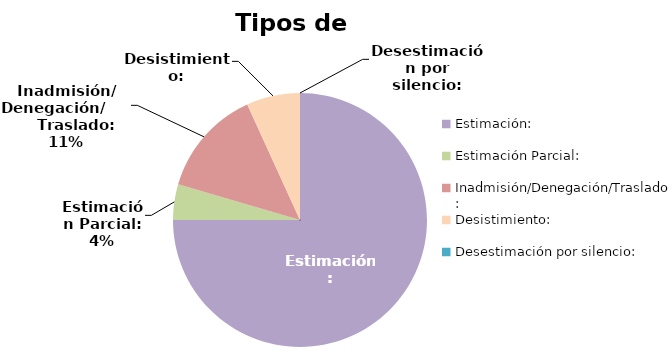
| Category | Tipos de resolución |
|---|---|
| Estimación: | 33 |
| Estimación Parcial: | 2 |
| Inadmisión/Denegación/Traslado: | 6 |
| Desistimiento: | 3 |
| Desestimación por silencio: | 0 |